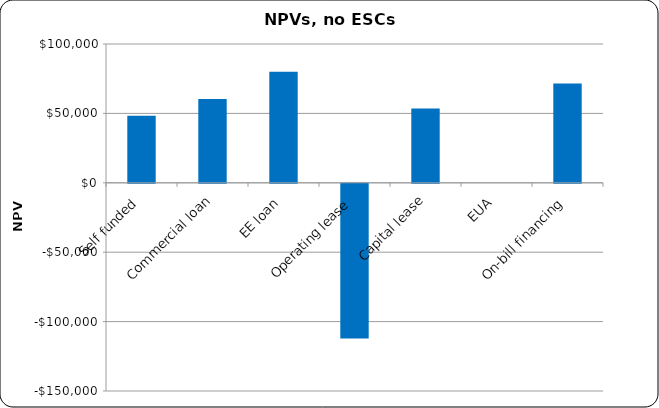
| Category | Series 0 |
|---|---|
| Self funded | 48267.985 |
| Commercial loan | 60425.713 |
| EE loan | 80014.648 |
| Operating lease | -111534.649 |
| Capital lease | 53619.509 |
| EUA | 0 |
| On-bill financing | 71513.256 |